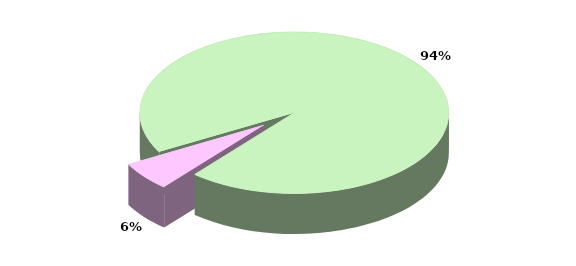
| Category | Series 0 |
|---|---|
| TOTALE ENTRATE CORRENTI | 23682.765 |
| TOTALE ENTRATE IN CONTO CAPITALE | 1458.588 |